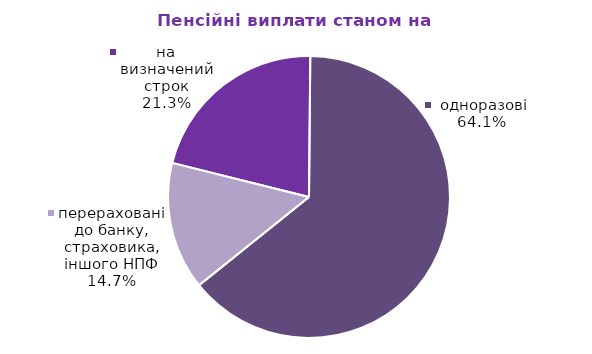
| Category | Series 0 |
|---|---|
| на визначений строк | 150.664 |
|  одноразові | 454.261 |
| перераховані до банку, страховика, іншого НПФ | 103.849 |